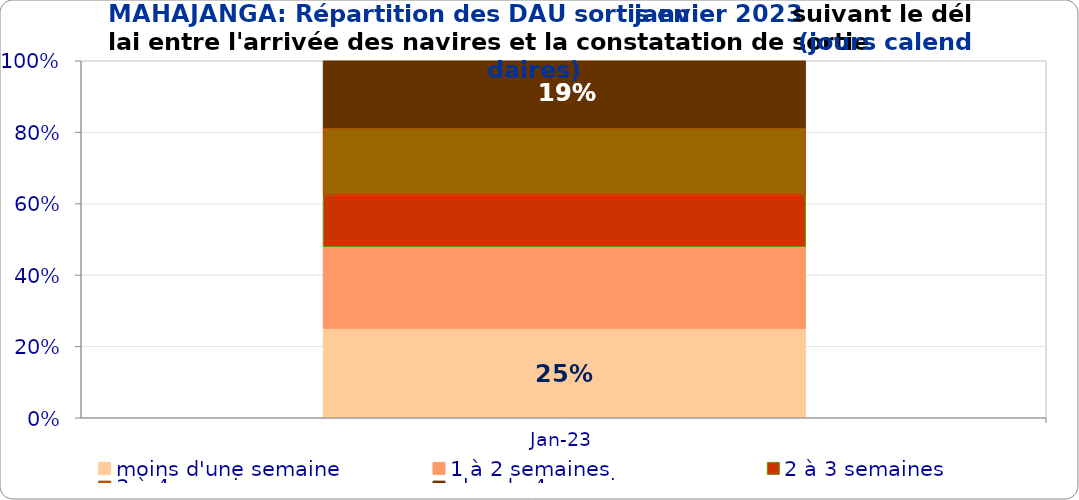
| Category | moins d'une semaine | 1 à 2 semaines | 2 à 3 semaines | 3 à 4 semaines | plus de 4 semaines |
|---|---|---|---|---|---|
| 2023-01-01 | 0.25 | 0.229 | 0.146 | 0.188 | 0.188 |